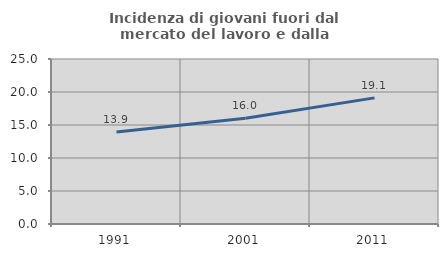
| Category | Incidenza di giovani fuori dal mercato del lavoro e dalla formazione  |
|---|---|
| 1991.0 | 13.935 |
| 2001.0 | 16.027 |
| 2011.0 | 19.112 |